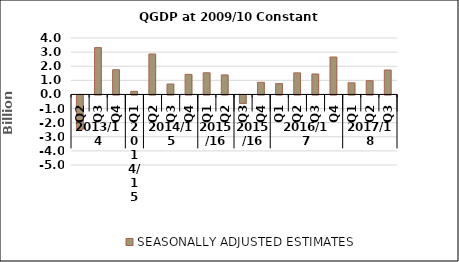
| Category | SEASONALLY ADJUSTED ESTIMATES |
|---|---|
| 0 | -2.428 |
| 1 | 3.319 |
| 2 | 1.752 |
| 3 | 0.222 |
| 4 | 2.865 |
| 5 | 0.739 |
| 6 | 1.423 |
| 7 | 1.536 |
| 8 | 1.383 |
| 9 | -0.598 |
| 10 | 0.86 |
| 11 | 0.767 |
| 12 | 1.529 |
| 13 | 1.449 |
| 14 | 2.651 |
| 15 | 0.823 |
| 16 | 0.976 |
| 17 | 1.731 |